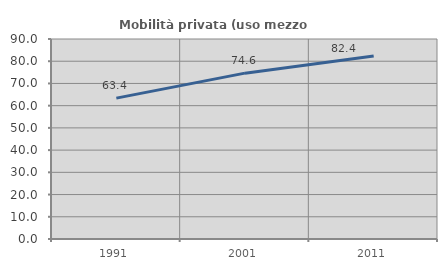
| Category | Mobilità privata (uso mezzo privato) |
|---|---|
| 1991.0 | 63.399 |
| 2001.0 | 74.634 |
| 2011.0 | 82.377 |